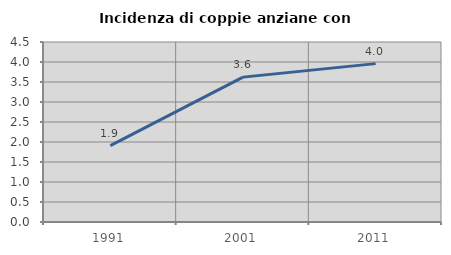
| Category | Incidenza di coppie anziane con figli |
|---|---|
| 1991.0 | 1.908 |
| 2001.0 | 3.622 |
| 2011.0 | 3.96 |